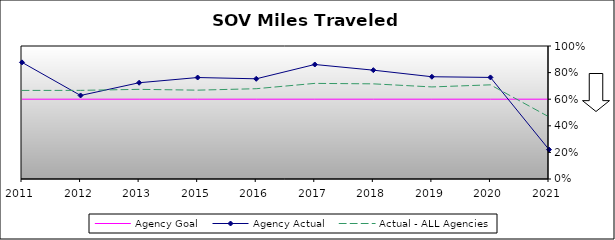
| Category | Agency Goal | Agency Actual | Actual - ALL Agencies |
|---|---|---|---|
| 2011.0 | 0.6 | 0.877 | 0.666 |
| 2012.0 | 0.6 | 0.628 | 0.666 |
| 2013.0 | 0.6 | 0.724 | 0.674 |
| 2015.0 | 0.6 | 0.763 | 0.668 |
| 2016.0 | 0.6 | 0.753 | 0.679 |
| 2017.0 | 0.6 | 0.861 | 0.719 |
| 2018.0 | 0.6 | 0.818 | 0.715 |
| 2019.0 | 0.6 | 0.769 | 0.692 |
| 2020.0 | 0.6 | 0.764 | 0.708 |
| 2021.0 | 0.6 | 0.221 | 0.467 |